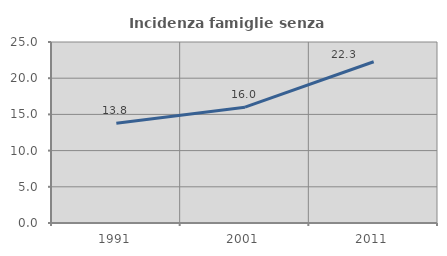
| Category | Incidenza famiglie senza nuclei |
|---|---|
| 1991.0 | 13.793 |
| 2001.0 | 16 |
| 2011.0 | 22.269 |